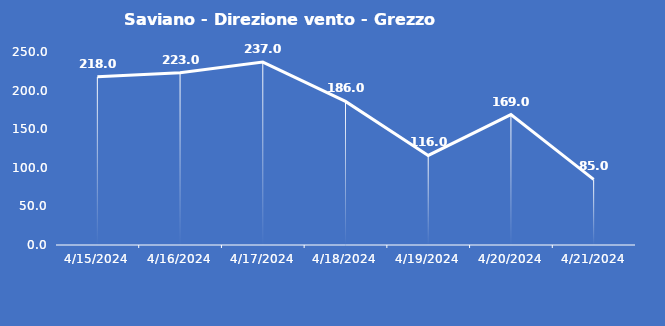
| Category | Saviano - Direzione vento - Grezzo (°N) |
|---|---|
| 4/15/24 | 218 |
| 4/16/24 | 223 |
| 4/17/24 | 237 |
| 4/18/24 | 186 |
| 4/19/24 | 116 |
| 4/20/24 | 169 |
| 4/21/24 | 85 |